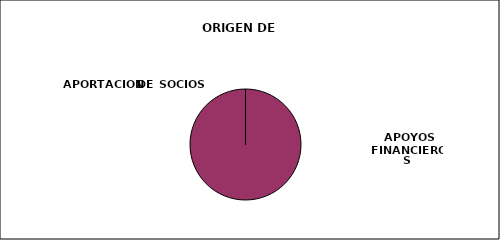
| Category | DEUDA |
|---|---|
| 0 | 0 |
| 1 | 1 |